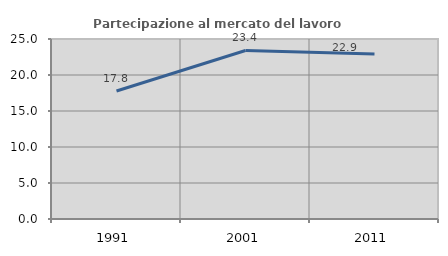
| Category | Partecipazione al mercato del lavoro  femminile |
|---|---|
| 1991.0 | 17.778 |
| 2001.0 | 23.404 |
| 2011.0 | 22.917 |